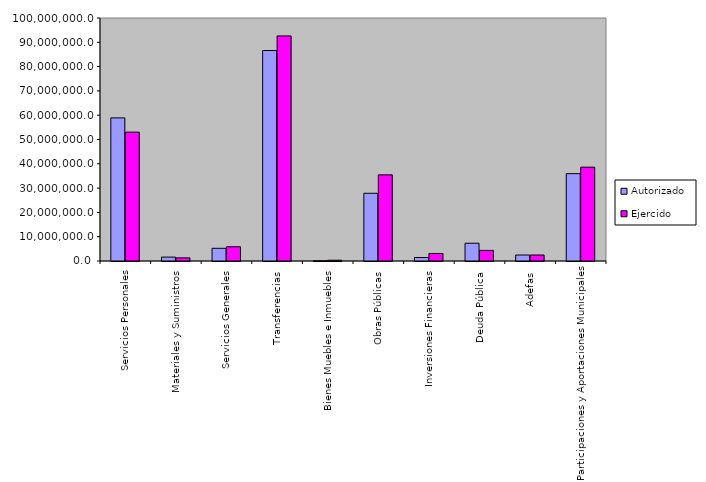
| Category | Autorizado | Ejercido |
|---|---|---|
| 0 | 58895890.9 | 53030608.2 |
| 1 | 1609010 | 1292616.3 |
| 2 | 5222315 | 5863604.1 |
| 3 | 86609265.4 | 92627698.7 |
| 4 | 101494.5 | 316561.3 |
| 5 | 27868073.5 | 35442988.8 |
| 6 | 1434450.6 | 3095630.8 |
| 7 | 7312000 | 4364273 |
| 8 | 2460700 | 2460655.6 |
| 9 | 35942109.8 | 38608967.3 |